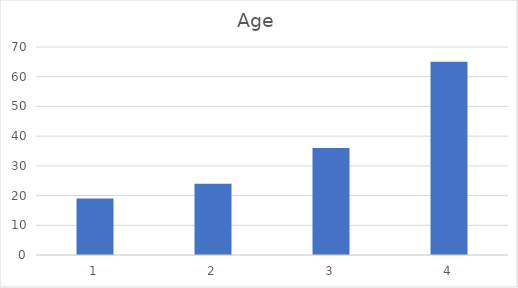
| Category | Age |
|---|---|
| 0 | 19 |
| 1 | 24 |
| 2 | 36 |
| 3 | 65 |